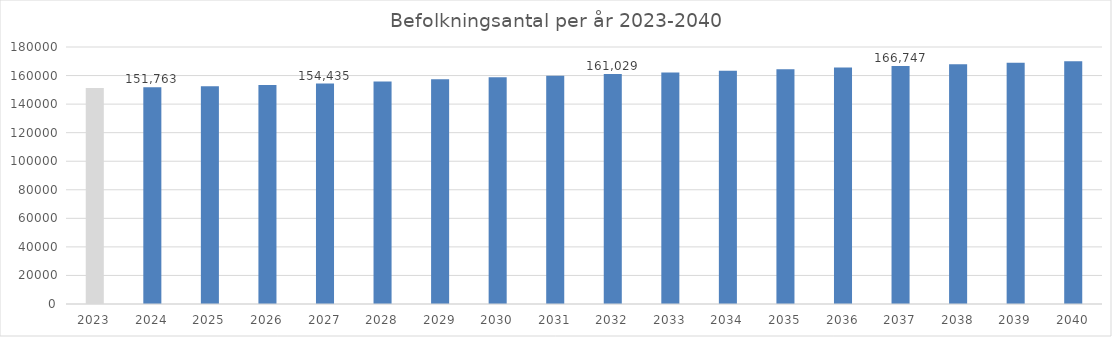
| Category | Series 0 |
|---|---|
| 2023.0 | 151306 |
| 2024.0 | 151762.685 |
| 2025.0 | 152480.026 |
| 2026.0 | 153361.025 |
| 2027.0 | 154435.188 |
| 2028.0 | 155808.487 |
| 2029.0 | 157325.234 |
| 2030.0 | 158758.1 |
| 2031.0 | 159886.066 |
| 2032.0 | 161029.069 |
| 2033.0 | 162189.999 |
| 2034.0 | 163335.384 |
| 2035.0 | 164490.926 |
| 2036.0 | 165628.108 |
| 2037.0 | 166747.393 |
| 2038.0 | 167848.478 |
| 2039.0 | 168931.93 |
| 2040.0 | 169998.467 |